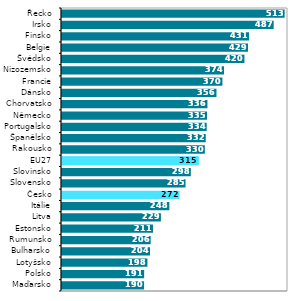
| Category |  2021 |
|---|---|
| Maďarsko | 190.417 |
| Polsko | 190.568 |
| Lotyšsko | 198.075 |
| Bulharsko | 204.061 |
| Rumunsko | 205.529 |
| Estonsko | 210.891 |
| Litva | 228.996 |
| Itálie | 248.279 |
| Česko | 271.721 |
| Slovensko | 285.378 |
| Slovinsko | 297.585 |
| EU27 | 314.849 |
| Rakousko | 329.678 |
| Španělsko | 331.739 |
| Portugalsko | 333.979 |
| Německo | 334.628 |
| Chorvatsko | 335.649 |
| Dánsko | 356.35 |
| Francie | 369.941 |
| Nizozemsko | 373.668 |
| Švédsko | 420.443 |
| Belgie | 428.663 |
| Finsko | 430.988 |
| Irsko | 487.45 |
| Řecko | 512.566 |